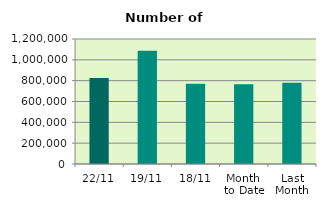
| Category | Series 0 |
|---|---|
| 22/11 | 824716 |
| 19/11 | 1086076 |
| 18/11 | 769914 |
| Month 
to Date | 764709.75 |
| Last
Month | 780428.952 |